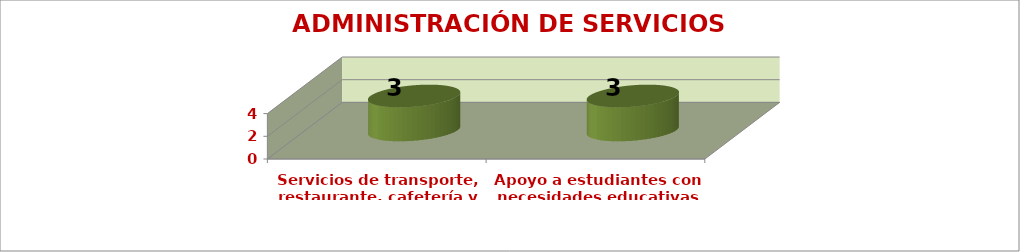
| Category | ADMINISTRACIÓN DE SERVICIOS COMPLEMENTARIOS |
|---|---|
| Servicios de transporte,
restaurante, cafetería y salud
(enfermería, odontología,
psicología) | 3 |
| Apoyo a estudiantes con
necesidades educativas
especiales | 3 |